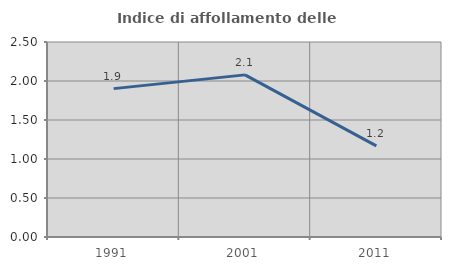
| Category | Indice di affollamento delle abitazioni  |
|---|---|
| 1991.0 | 1.902 |
| 2001.0 | 2.079 |
| 2011.0 | 1.168 |